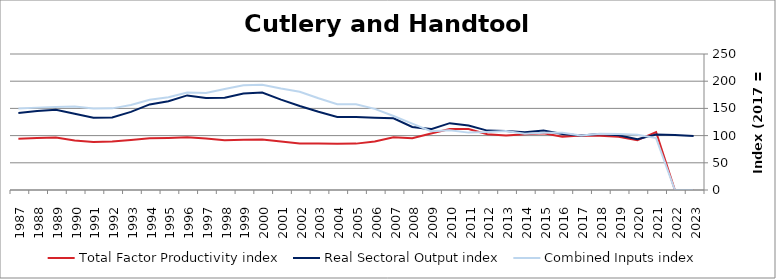
| Category | Total Factor Productivity index | Real Sectoral Output index | Combined Inputs index |
|---|---|---|---|
| 2023.0 | 0 | 99.054 | 0 |
| 2022.0 | 0 | 101.059 | 0 |
| 2021.0 | 106.642 | 101.857 | 95.513 |
| 2020.0 | 91.729 | 93.213 | 101.617 |
| 2019.0 | 97.759 | 100.674 | 102.981 |
| 2018.0 | 99.642 | 102.901 | 103.271 |
| 2017.0 | 100 | 100 | 100 |
| 2016.0 | 98.119 | 103.151 | 105.128 |
| 2015.0 | 104.137 | 109.415 | 105.069 |
| 2014.0 | 102.494 | 106.07 | 103.489 |
| 2013.0 | 100.066 | 108.348 | 108.277 |
| 2012.0 | 102.526 | 109.173 | 106.483 |
| 2011.0 | 112.285 | 118.432 | 105.474 |
| 2010.0 | 112.07 | 122.847 | 109.617 |
| 2009.0 | 103.715 | 111.925 | 107.916 |
| 2008.0 | 95.012 | 115.953 | 122.041 |
| 2007.0 | 96.921 | 131.793 | 135.98 |
| 2006.0 | 89.198 | 133.041 | 149.154 |
| 2005.0 | 85.25 | 134.216 | 157.437 |
| 2004.0 | 85.155 | 134.326 | 157.743 |
| 2003.0 | 85.342 | 143.852 | 168.559 |
| 2002.0 | 85.457 | 154.289 | 180.546 |
| 2001.0 | 89.083 | 166.075 | 186.429 |
| 2000.0 | 92.634 | 179.218 | 193.47 |
| 1999.0 | 92.235 | 177.477 | 192.418 |
| 1998.0 | 91.397 | 169.701 | 185.674 |
| 1997.0 | 94.735 | 169.036 | 178.43 |
| 1996.0 | 96.949 | 173.882 | 179.354 |
| 1995.0 | 95.747 | 163.134 | 170.381 |
| 1994.0 | 94.951 | 157.364 | 165.733 |
| 1993.0 | 91.894 | 143.629 | 156.298 |
| 1992.0 | 88.949 | 133.477 | 150.06 |
| 1991.0 | 88.413 | 132.632 | 150.015 |
| 1990.0 | 91.206 | 140.148 | 153.661 |
| 1989.0 | 96.627 | 147.52 | 152.67 |
| 1988.0 | 95.767 | 145.015 | 151.425 |
| 1987.0 | 94.268 | 141.382 | 149.979 |